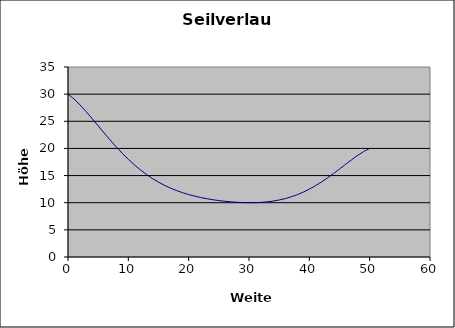
| Category | Series 0 |
|---|---|
| 0.0 | 30 |
| 1.0 | 29.097 |
| 2.0 | 28.005 |
| 3.0 | 26.785 |
| 4.0 | 25.489 |
| 5.0 | 24.16 |
| 6.0 | 22.832 |
| 7.0 | 21.533 |
| 8.0 | 20.285 |
| 9.0 | 19.104 |
| 10.0 | 18 |
| 11.0 | 16.981 |
| 12.0 | 16.052 |
| 13.0 | 15.211 |
| 14.0 | 14.458 |
| 15.0 | 13.789 |
| 16.0 | 13.199 |
| 17.0 | 12.682 |
| 18.0 | 12.231 |
| 19.0 | 11.839 |
| 20.0 | 11.5 |
| 21.0 | 11.207 |
| 22.0 | 10.955 |
| 23.0 | 10.737 |
| 24.0 | 10.551 |
| 25.0 | 10.393 |
| 26.0 | 10.262 |
| 27.0 | 10.155 |
| 28.0 | 10.075 |
| 29.0 | 10.022 |
| 30.0 | 10 |
| 31.0 | 10.012 |
| 32.0 | 10.062 |
| 33.0 | 10.157 |
| 34.0 | 10.301 |
| 35.0 | 10.5 |
| 36.0 | 10.76 |
| 37.0 | 11.087 |
| 38.0 | 11.484 |
| 39.0 | 11.955 |
| 40.0 | 12.5 |
| 41.0 | 13.119 |
| 42.0 | 13.809 |
| 43.0 | 14.561 |
| 44.0 | 15.366 |
| 45.0 | 16.207 |
| 46.0 | 17.064 |
| 47.0 | 17.909 |
| 48.0 | 18.709 |
| 49.0 | 19.423 |
| 50.0 | 20 |